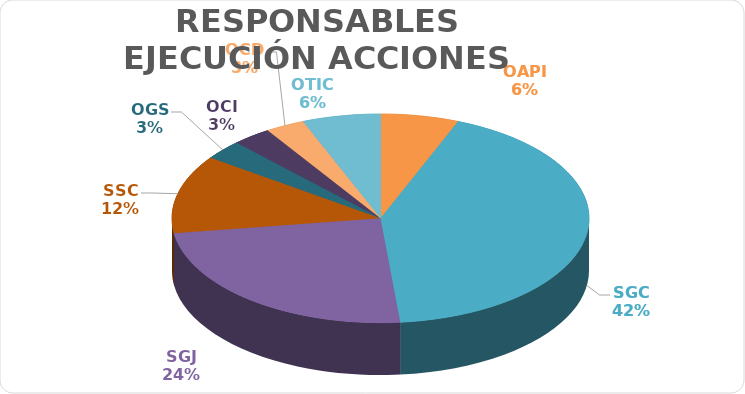
| Category | Series 0 |
|---|---|
| OAPI | 2 |
| SGC | 14 |
| SGJ | 8 |
| SSC | 4 |
| OGS | 1 |
| OCI | 1 |
| OCD | 1 |
| OTIC | 2 |